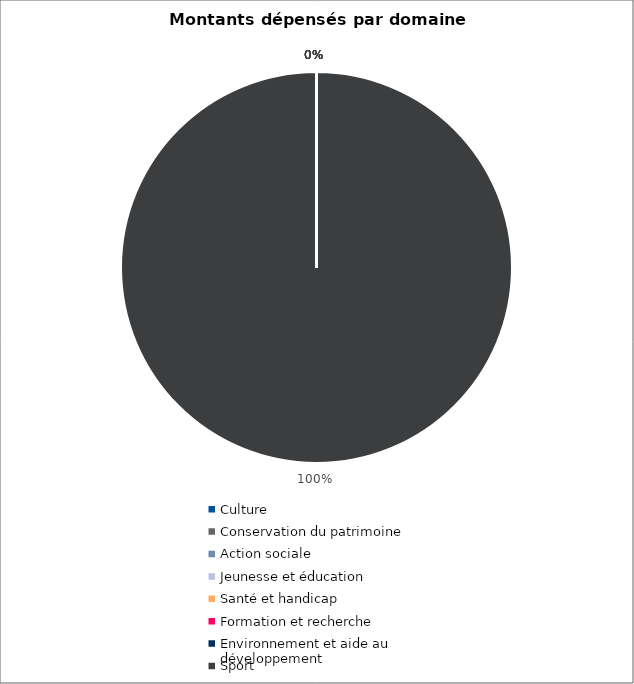
| Category | Series 0 |
|---|---|
| Culture | 0 |
| Conservation du patrimoine | 0 |
| Action sociale | 0 |
| Jeunesse et éducation | 0 |
| Santé et handicap | 0 |
| Formation et recherche | 0 |
| Environnement et aide au
développement | 0 |
| Sport | 5376151.47 |
| Autres projets d’utilité publique | 0 |